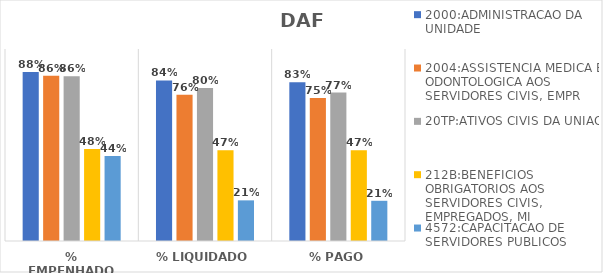
| Category | 2000:ADMINISTRACAO DA UNIDADE | 2004:ASSISTENCIA MEDICA E ODONTOLOGICA AOS SERVIDORES CIVIS, EMPR | 20TP:ATIVOS CIVIS DA UNIAO | 212B:BENEFICIOS OBRIGATORIOS AOS SERVIDORES CIVIS, EMPREGADOS, MI | 4572:CAPACITACAO DE SERVIDORES PUBLICOS FEDERAIS EM PROCESSO DE Q |
|---|---|---|---|---|---|
| % EMPENHADO | 0.88 | 0.861 | 0.858 | 0.479 | 0.443 |
| % LIQUIDADO | 0.836 | 0.762 | 0.797 | 0.473 | 0.212 |
| % PAGO | 0.827 | 0.745 | 0.773 | 0.473 | 0.209 |